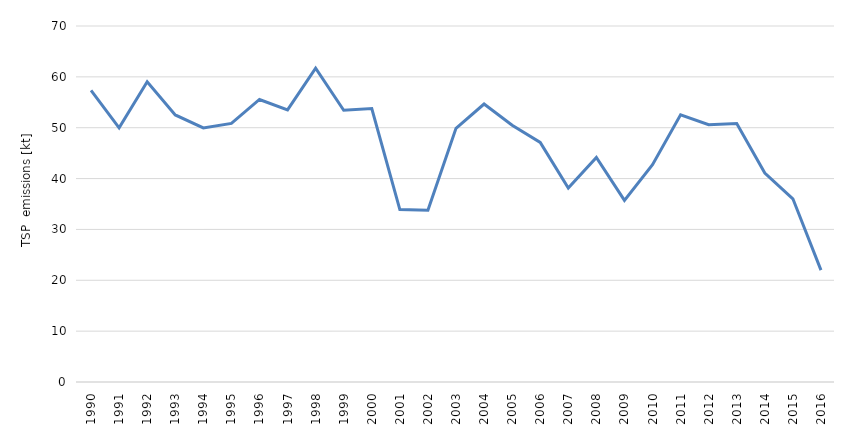
| Category | Series 0 |
|---|---|
| 1990.0 | 57.361 |
| 1991.0 | 49.967 |
| 1992.0 | 59.027 |
| 1993.0 | 52.515 |
| 1994.0 | 49.953 |
| 1995.0 | 50.856 |
| 1996.0 | 55.552 |
| 1997.0 | 53.497 |
| 1998.0 | 61.715 |
| 1999.0 | 53.422 |
| 2000.0 | 53.773 |
| 2001.0 | 33.909 |
| 2002.0 | 33.776 |
| 2003.0 | 49.887 |
| 2004.0 | 54.653 |
| 2005.0 | 50.481 |
| 2006.0 | 47.112 |
| 2007.0 | 38.15 |
| 2008.0 | 44.158 |
| 2009.0 | 35.7 |
| 2010.0 | 42.738 |
| 2011.0 | 52.537 |
| 2012.0 | 50.578 |
| 2013.0 | 50.84 |
| 2014.0 | 41.093 |
| 2015.0 | 36.027 |
| 2016.0 | 22.001 |